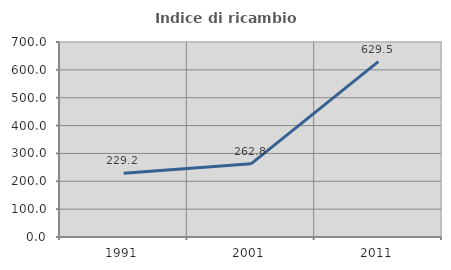
| Category | Indice di ricambio occupazionale  |
|---|---|
| 1991.0 | 229.221 |
| 2001.0 | 262.759 |
| 2011.0 | 629.474 |